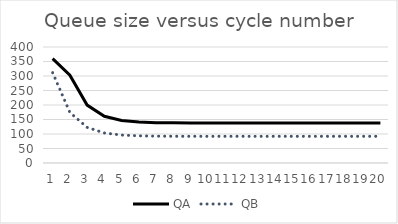
| Category | QA | QB |
|---|---|---|
| 0 | 360 | 311.5 |
| 1 | 302.625 | 174.312 |
| 2 | 199.734 | 122.867 |
| 3 | 161.15 | 103.575 |
| 4 | 146.681 | 96.341 |
| 5 | 141.256 | 93.628 |
| 6 | 139.221 | 92.61 |
| 7 | 138.458 | 92.229 |
| 8 | 138.172 | 92.086 |
| 9 | 138.064 | 92.032 |
| 10 | 138.024 | 92.012 |
| 11 | 138.009 | 92.005 |
| 12 | 138.003 | 92.002 |
| 13 | 138.001 | 92.001 |
| 14 | 138 | 92 |
| 15 | 138 | 92 |
| 16 | 138 | 92 |
| 17 | 138 | 92 |
| 18 | 138 | 92 |
| 19 | 138 | 92 |